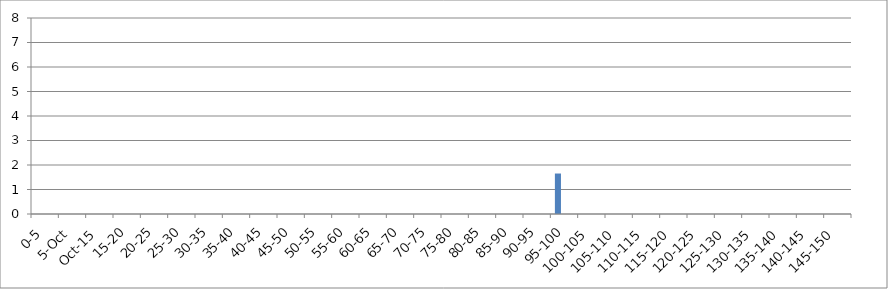
| Category | 12 UNION_ALL | 12 INTERSECTION_ALL | 12 UNION(INTERSECTION_119875_146067,INTERSECTION_119875_241240,INTERSECTION_146067_241240) |
|---|---|---|---|
| 0-5 | 0 | 0 | 0 |
| 5-Oct | 0 | 0 | 0 |
| Oct-15 | 0 | 0 | 0 |
| 15-20 | 0 | 0 | 0 |
| 20-25 | 0 | 0 | 0 |
| 25-30 | 0 | 0 | 0 |
| 30-35 | 0 | 0 | 0 |
| 35-40 | 0 | 0 | 0 |
| 40-45 | 0 | 0 | 0 |
| 45-50 | 0 | 0 | 0 |
| 50-55 | 0 | 0 | 0 |
| 55-60 | 0 | 0 | 0 |
| 60-65 | 0 | 0 | 0 |
| 65-70 | 0 | 0 | 0 |
| 70-75 | 0 | 0 | 0 |
| 75-80 | 0 | 0 | 0 |
| 80-85 | 0 | 0 | 0 |
| 85-90 | 0 | 0 | 0 |
| 90-95 | 0 | 0 | 0 |
| 95-100 | 1.652 | 0 | 0 |
| 100-105 | 0 | 0 | 0 |
| 105-110 | 0 | 0 | 0 |
| 110-115 | 0 | 0 | 0 |
| 115-120 | 0 | 0 | 0 |
| 120-125 | 0 | 0 | 0 |
| 125-130 | 0 | 0 | 0 |
| 130-135 | 0 | 0 | 0 |
| 135-140 | 0 | 0 | 0 |
| 140-145 | 0 | 0 | 0 |
| 145-150 | 0 | 0 | 0 |